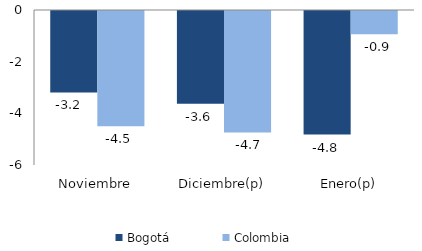
| Category | Bogotá | Colombia |
|---|---|---|
| Noviembre | -3.151 | -4.462 |
| Diciembre(p) | -3.588 | -4.7 |
| Enero(p) | -4.785 | -0.902 |